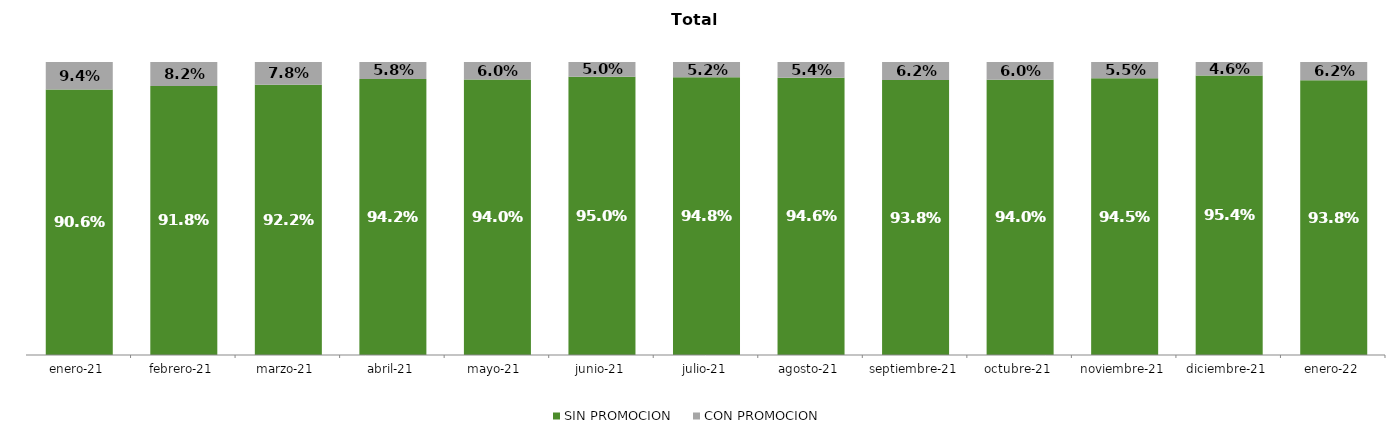
| Category | SIN PROMOCION   | CON PROMOCION   |
|---|---|---|
| 2021-01-01 | 0.906 | 0.094 |
| 2021-02-01 | 0.918 | 0.082 |
| 2021-03-01 | 0.922 | 0.078 |
| 2021-04-01 | 0.942 | 0.058 |
| 2021-05-01 | 0.94 | 0.06 |
| 2021-06-01 | 0.95 | 0.05 |
| 2021-07-01 | 0.948 | 0.052 |
| 2021-08-01 | 0.946 | 0.054 |
| 2021-09-01 | 0.938 | 0.062 |
| 2021-10-01 | 0.94 | 0.06 |
| 2021-11-01 | 0.945 | 0.055 |
| 2021-12-01 | 0.954 | 0.046 |
| 2022-01-01 | 0.938 | 0.062 |